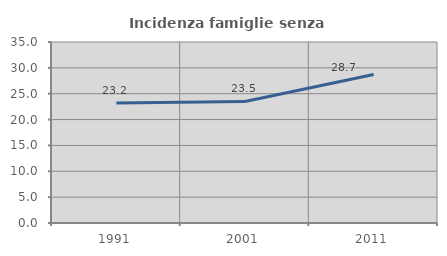
| Category | Incidenza famiglie senza nuclei |
|---|---|
| 1991.0 | 23.183 |
| 2001.0 | 23.511 |
| 2011.0 | 28.732 |